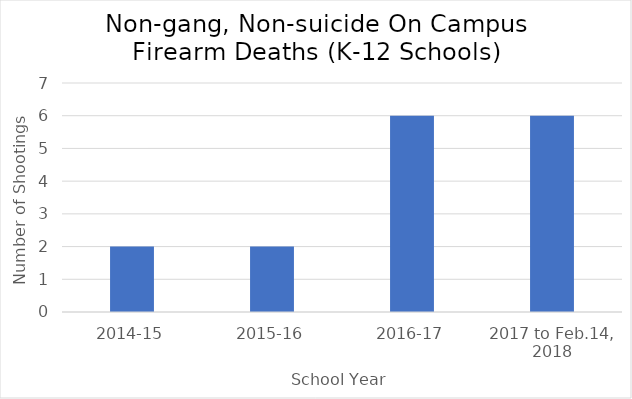
| Category | Number of Shootinng_K12 |
|---|---|
| 2014-15 | 2 |
| 2015-16 | 2 |
| 2016-17 | 6 |
| 2017 to Feb.14, 2018 | 6 |